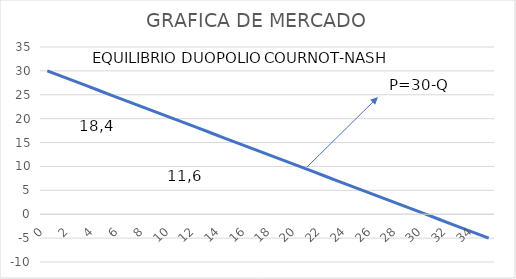
| Category | P |
|---|---|
| 0.0 | 30 |
| 1.0 | 29 |
| 2.0 | 28 |
| 3.0 | 27 |
| 4.0 | 26 |
| 5.0 | 25 |
| 6.0 | 24 |
| 7.0 | 23 |
| 8.0 | 22 |
| 9.0 | 21 |
| 10.0 | 20 |
| 11.0 | 19 |
| 12.0 | 18 |
| 13.0 | 17 |
| 14.0 | 16 |
| 15.0 | 15 |
| 16.0 | 14 |
| 17.0 | 13 |
| 18.0 | 12 |
| 19.0 | 11 |
| 20.0 | 10 |
| 21.0 | 9 |
| 22.0 | 8 |
| 23.0 | 7 |
| 24.0 | 6 |
| 25.0 | 5 |
| 26.0 | 4 |
| 27.0 | 3 |
| 28.0 | 2 |
| 29.0 | 1 |
| 30.0 | 0 |
| 31.0 | -1 |
| 32.0 | -2 |
| 33.0 | -3 |
| 34.0 | -4 |
| 35.0 | -5 |